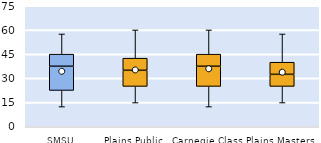
| Category | 25th | 50th | 75th |
|---|---|---|---|
| SMSU | 22.5 | 15 | 7.5 |
| Plains Public | 25 | 10 | 7.5 |
| Carnegie Class | 25 | 12.5 | 7.5 |
| Plains Masters | 25 | 7.5 | 7.5 |